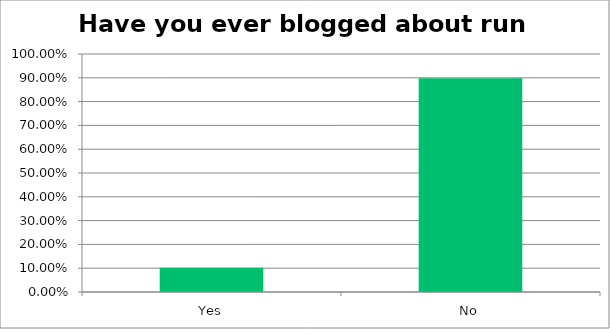
| Category | Responses |
|---|---|
| Yes | 0.102 |
| No | 0.898 |